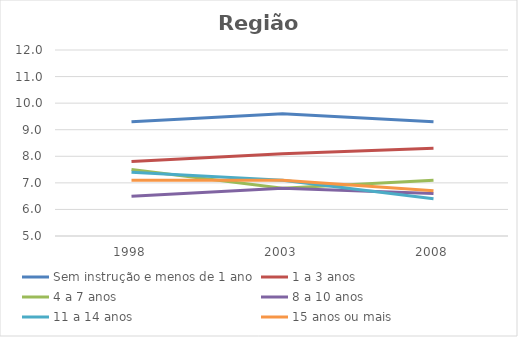
| Category | Sem instrução e menos de 1 ano | 1 a 3 anos | 4 a 7 anos | 8 a 10 anos | 11 a 14 anos | 15 anos ou mais |
|---|---|---|---|---|---|---|
| 1998.0 | 9.3 | 7.8 | 7.5 | 6.5 | 7.4 | 7.1 |
| 2003.0 | 9.6 | 8.1 | 6.8 | 6.8 | 7.1 | 7.1 |
| 2008.0 | 9.3 | 8.3 | 7.1 | 6.6 | 6.4 | 6.7 |